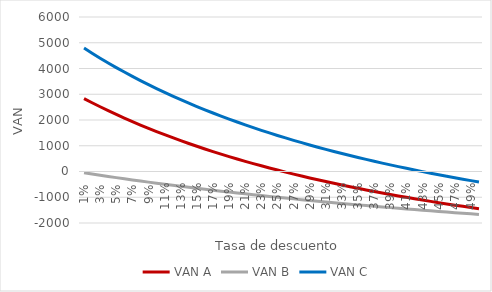
| Category | VAN A | VAN B | VAN C |
|---|---|---|---|
| 0.01 | 2832.857 | -49.505 | 4793.643 |
| 0.02 | 2671.258 | -98.039 | 4594.349 |
| 0.03 | 2514.96 | -145.631 | 4401.799 |
| 0.04 | 2363.735 | -192.308 | 4215.692 |
| 0.05 | 2217.363 | -238.095 | 4035.741 |
| 0.06 | 2075.64 | -283.019 | 3861.678 |
| 0.07 | 1938.369 | -327.103 | 3693.246 |
| 0.08 | 1805.365 | -370.37 | 3530.204 |
| 0.09 | 1676.453 | -412.844 | 3372.322 |
| 0.1 | 1551.465 | -454.545 | 3219.384 |
| 0.11 | 1430.243 | -495.495 | 3071.183 |
| 0.12 | 1312.637 | -535.714 | 2927.524 |
| 0.13 | 1198.502 | -575.221 | 2788.221 |
| 0.14 | 1087.703 | -614.035 | 2653.097 |
| 0.15 | 980.11 | -652.174 | 2521.986 |
| 0.16 | 875.6 | -689.655 | 2394.727 |
| 0.17 | 774.054 | -726.496 | 2271.17 |
| 0.18 | 675.361 | -762.712 | 2151.169 |
| 0.19 | 579.414 | -798.319 | 2034.588 |
| 0.2 | 486.111 | -833.333 | 1921.296 |
| 0.21 | 395.355 | -867.769 | 1811.168 |
| 0.22 | 307.052 | -901.639 | 1704.085 |
| 0.23 | 221.115 | -934.959 | 1599.934 |
| 0.24 | 137.458 | -967.742 | 1498.607 |
| 0.25 | 56 | -1000 | 1400 |
| 0.26 | -23.336 | -1031.746 | 1304.015 |
| 0.27 | -100.623 | -1062.992 | 1210.557 |
| 0.28 | -175.934 | -1093.75 | 1119.537 |
| 0.29 | -249.335 | -1124.031 | 1030.869 |
| 0.3 | -320.892 | -1153.846 | 944.47 |
| 0.31 | -390.667 | -1183.206 | 860.261 |
| 0.32 | -458.719 | -1212.121 | 778.167 |
| 0.33 | -525.107 | -1240.602 | 698.117 |
| 0.34 | -589.883 | -1268.657 | 620.04 |
| 0.35 | -653.102 | -1296.296 | 543.87 |
| 0.36 | -714.813 | -1323.529 | 469.545 |
| 0.37 | -775.065 | -1350.365 | 397.003 |
| 0.38 | -833.904 | -1376.812 | 326.186 |
| 0.39 | -891.376 | -1402.878 | 257.038 |
| 0.4 | -947.522 | -1428.571 | 189.504 |
| 0.41 | -1002.384 | -1453.901 | 123.535 |
| 0.42 | -1056.003 | -1478.873 | 59.079 |
| 0.43 | -1108.415 | -1503.497 | -3.91 |
| 0.44 | -1159.658 | -1527.778 | -65.479 |
| 0.45 | -1209.767 | -1551.724 | -125.671 |
| 0.46 | -1258.775 | -1575.342 | -184.529 |
| 0.47 | -1306.716 | -1598.639 | -242.093 |
| 0.48 | -1353.622 | -1621.622 | -298.403 |
| 0.49 | -1399.521 | -1644.295 | -353.495 |
| 0.5 | -1444.444 | -1666.667 | -407.407 |